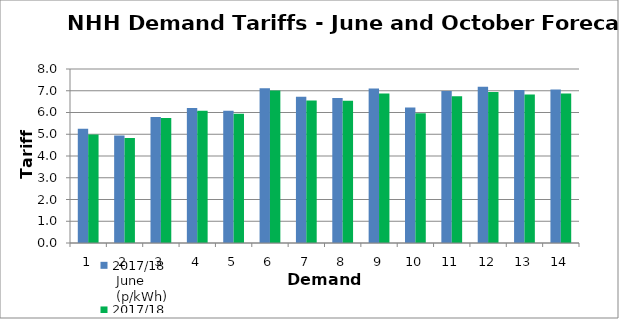
| Category | 2017/18
 June
 (p/kWh) | 2017/18
October
(p/kWh) |
|---|---|---|
| 0 | 5.252 | 4.984 |
| 1 | 4.939 | 4.831 |
| 2 | 5.794 | 5.746 |
| 3 | 6.202 | 6.076 |
| 4 | 6.085 | 5.942 |
| 5 | 7.111 | 7.007 |
| 6 | 6.727 | 6.551 |
| 7 | 6.667 | 6.536 |
| 8 | 7.105 | 6.872 |
| 9 | 6.227 | 5.969 |
| 10 | 6.987 | 6.753 |
| 11 | 7.18 | 6.946 |
| 12 | 7.04 | 6.828 |
| 13 | 7.059 | 6.868 |